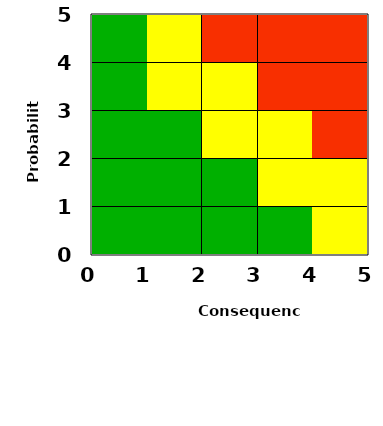
| Category | Series 0 |
|---|---|
| 2.4285714285714284 | 0 |